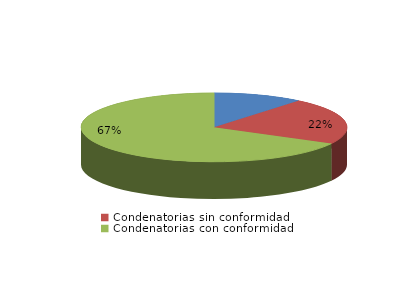
| Category | Series 0 |
|---|---|
| Absolutorias | 7 |
| Condenatorias sin conformidad | 14 |
| Condenatorias con conformidad | 43 |